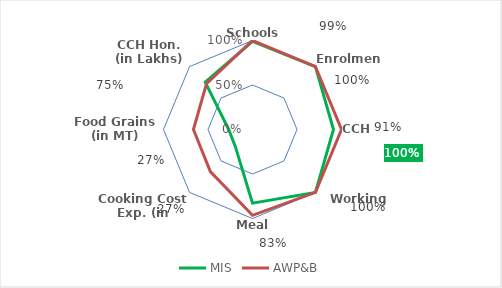
| Category | MIS | AWP&B |
|---|---|---|
| Schools  | 0.99 | 1 |
| Enrolment | 1 | 1 |
| CCH | 0.91 | 1 |
| Working days | 1 | 1 |
| Meal served | 0.827 | 0.965 |
| Cooking Cost Exp. (in Lakhs) | 0.272 | 0.669 |
| Food Grains (in MT) | 0.267 | 0.664 |
| CCH Hon. (in Lakhs) | 0.751 | 0.73 |